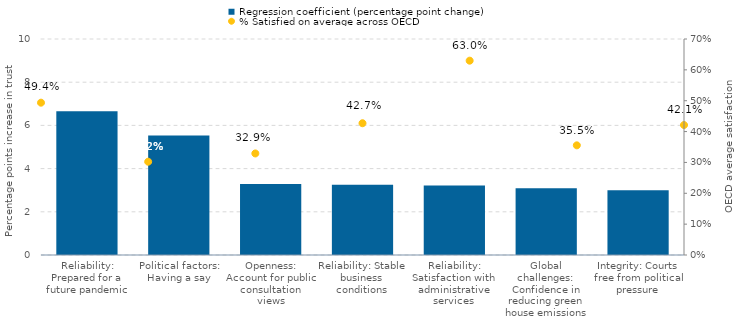
| Category | Regression coefficient (percentage point change) |
|---|---|
| Reliability: Prepared for a future pandemic | 6.652 |
| Political factors: Having a say | 5.535 |
| Openness: Account for public consultation views | 3.292 |
| Reliability: Stable business conditions | 3.254 |
| Reliability: Satisfaction with administrative services | 3.215 |
| Global challenges: Confidence in reducing green house emissions | 3.091 |
| Integrity: Courts free from political pressure | 3.001 |